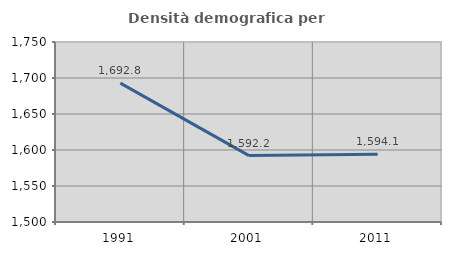
| Category | Densità demografica |
|---|---|
| 1991.0 | 1692.828 |
| 2001.0 | 1592.233 |
| 2011.0 | 1594.103 |